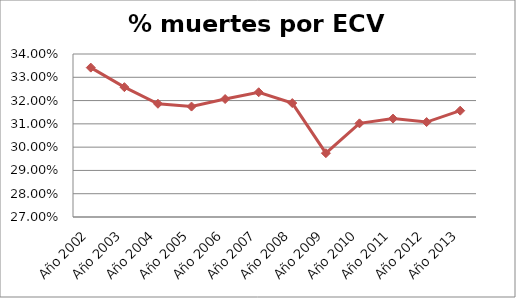
| Category | Series 0 |
|---|---|
| Año 2002 | 0.334 |
| Año 2003 | 0.326 |
| Año 2004 | 0.319 |
| Año 2005 | 0.317 |
| Año 2006 | 0.321 |
| Año 2007 | 0.324 |
| Año 2008 | 0.319 |
| Año 2009 | 0.297 |
| Año 2010 | 0.31 |
| Año 2011 | 0.312 |
| Año 2012 | 0.311 |
| Año 2013 | 0.316 |